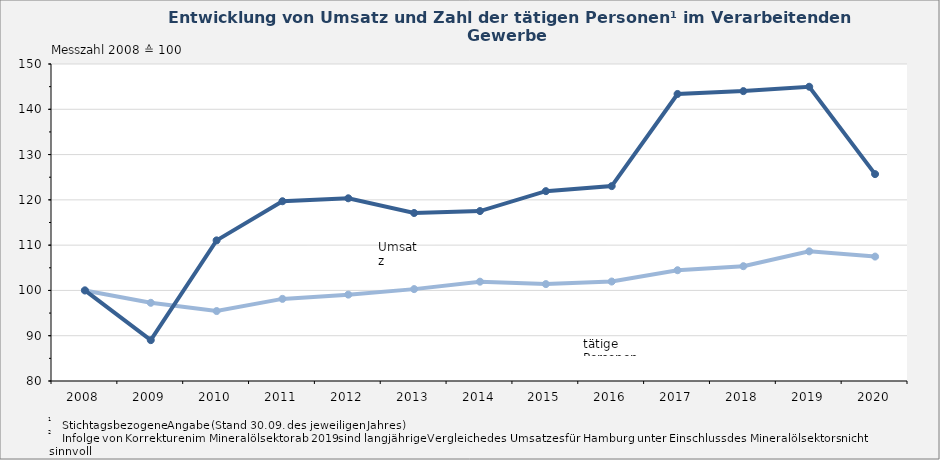
| Category | tätige Personen | Umsatz in 1000 Euro |
|---|---|---|
| 2008.0 | 100 | 100 |
| 2009.0 | 97.265 | 89.021 |
| 2010.0 | 95.447 | 111.053 |
| 2011.0 | 98.132 | 119.695 |
| 2012.0 | 99.072 | 120.348 |
| 2013.0 | 100.289 | 117.095 |
| 2014.0 | 101.934 | 117.523 |
| 2015.0 | 101.399 | 121.925 |
| 2016.0 | 101.964 | 123.035 |
| 2017.0 | 104.461 | 143.381 |
| 2018.0 | 105.354 | 144.013 |
| 2019.0 | 108.628 | 144.978 |
| 2020.0 | 107.476 | 125.683 |